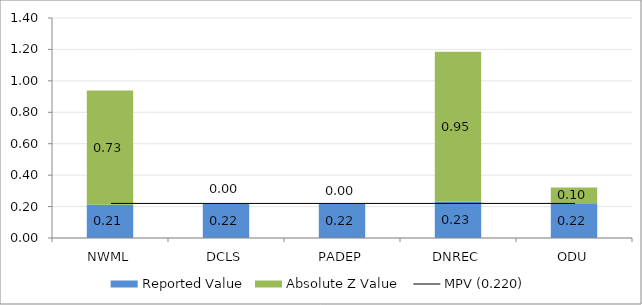
| Category | Reported Value | Absolute Z Value  |
|---|---|---|
| NWML | 0.212 | 0.727 |
| DCLS | 0.22 | 0 |
| PADEP | 0.22 | 0 |
| DNREC | 0.23 | 0.955 |
| ODU | 0.221 | 0.1 |